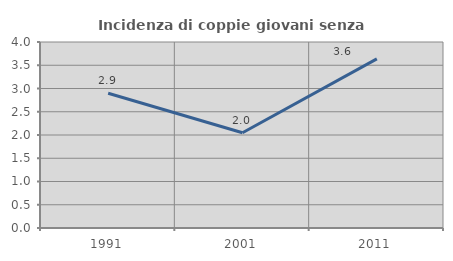
| Category | Incidenza di coppie giovani senza figli |
|---|---|
| 1991.0 | 2.899 |
| 2001.0 | 2.049 |
| 2011.0 | 3.636 |